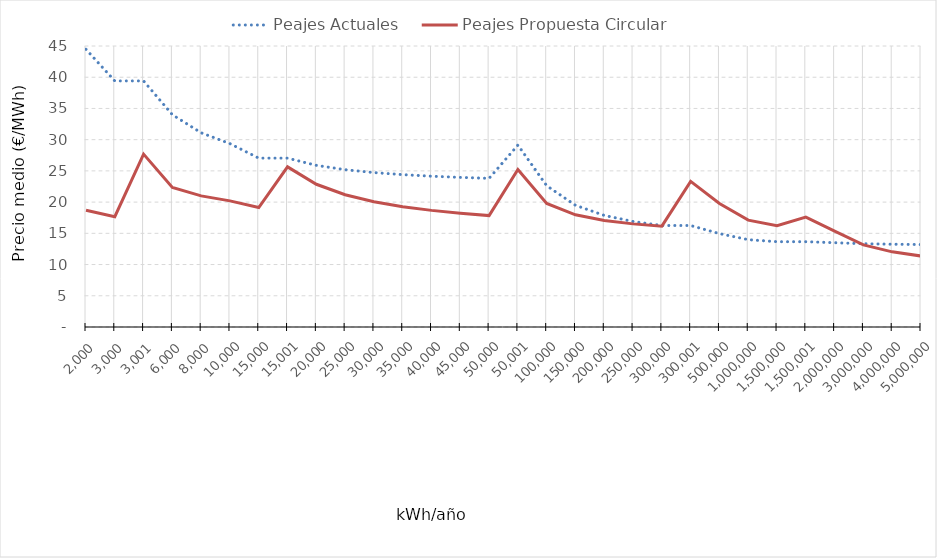
| Category | Peajes Actuales | Peajes Propuesta Circular |
|---|---|---|
| 2000.0 | 44.467 | 18.688 |
| 3000.0 | 39.407 | 17.662 |
| 3001.0 | 39.404 | 27.681 |
| 6000.0 | 33.993 | 22.335 |
| 8000.0 | 31.098 | 20.998 |
| 10000.0 | 29.361 | 20.195 |
| 15000.0 | 27.045 | 19.125 |
| 15001.0 | 27.045 | 25.643 |
| 20000.0 | 25.887 | 22.856 |
| 25000.0 | 25.192 | 21.184 |
| 30000.0 | 24.729 | 20.069 |
| 35000.0 | 24.398 | 19.272 |
| 40000.0 | 24.15 | 18.675 |
| 45000.0 | 23.957 | 18.211 |
| 50000.0 | 23.803 | 17.839 |
| 50001.0 | 29.13 | 25.228 |
| 100000.0 | 22.623 | 19.782 |
| 150000.0 | 19.49 | 17.966 |
| 200000.0 | 17.87 | 17.058 |
| 250000.0 | 16.899 | 16.514 |
| 300000.0 | 16.251 | 16.151 |
| 300001.0 | 16.251 | 23.322 |
| 500000.0 | 14.955 | 19.771 |
| 1000000.0 | 13.984 | 17.108 |
| 1500000.0 | 13.66 | 16.22 |
| 1500001.0 | 13.66 | 17.589 |
| 2000000.0 | 13.498 | 15.367 |
| 3000000.0 | 13.336 | 13.145 |
| 4000000.0 | 13.255 | 12.035 |
| 5000000.0 | 13.206 | 11.368 |